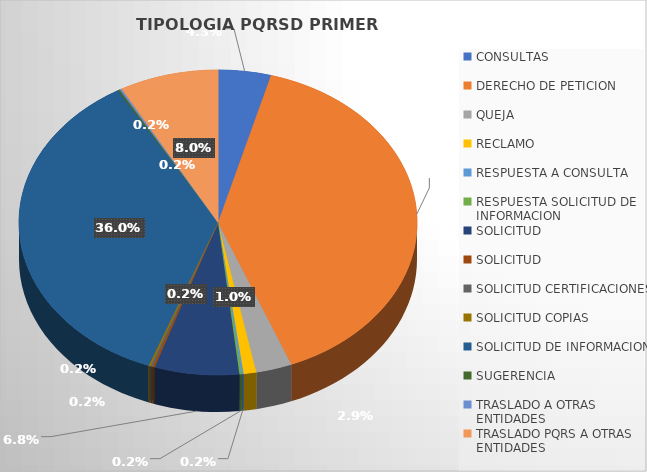
| Category | CANTIDAD |
|---|---|
| CONSULTAS | 25 |
| DERECHO DE PETICION | 232 |
| QUEJA | 17 |
| RECLAMO | 6 |
| RESPUESTA A CONSULTA | 1 |
| RESPUESTA SOLICITUD DE INFORMACION | 1 |
| SOLICITUD | 40 |
| SOLICITUD  | 1 |
| SOLICITUD CERTIFICACIONES | 1 |
| SOLICITUD COPIAS | 1 |
| SOLICITUD DE INFORMACION | 210 |
| SUGERENCIA | 1 |
| TRASLADO A OTRAS ENTIDADES | 1 |
| TRASLADO PQRS A OTRAS ENTIDADES | 47 |